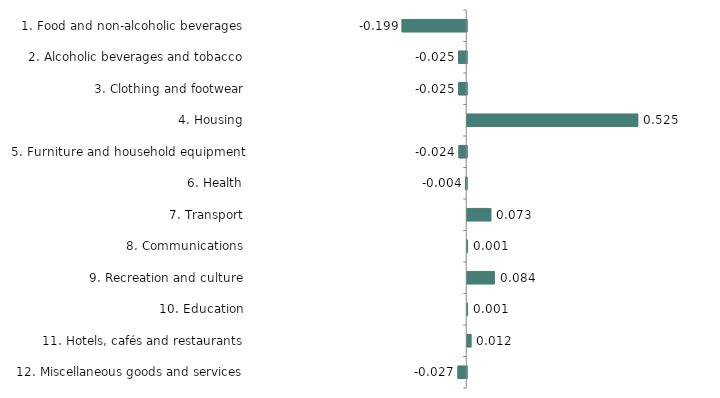
| Category | Series 0 |
|---|---|
| 1. Food and non-alcoholic beverages | -0.199 |
| 2. Alcoholic beverages and tobacco | -0.025 |
| 3. Clothing and footwear | -0.025 |
| 4. Housing | 0.525 |
| 5. Furniture and household equipment | -0.024 |
| 6. Health | -0.004 |
| 7. Transport | 0.073 |
| 8. Communications | 0.001 |
| 9. Recreation and culture | 0.084 |
| 10. Education | 0.001 |
| 11. Hotels, cafés and restaurants | 0.012 |
| 12. Miscellaneous goods and services | -0.027 |